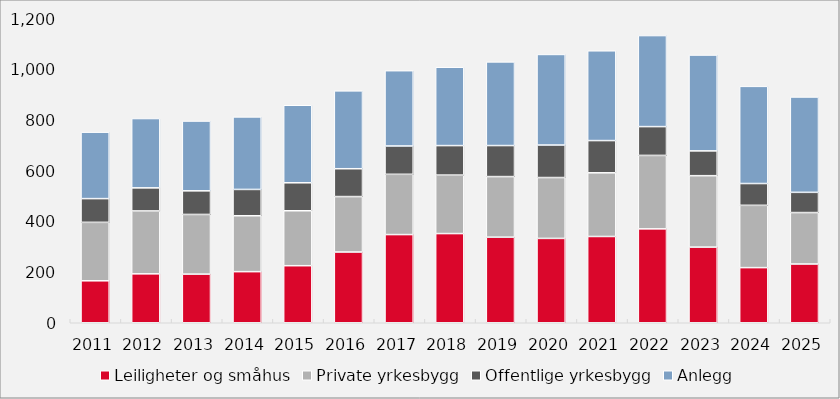
| Category | Leiligheter og småhus | Private yrkesbygg | Offentlige yrkesbygg | Anlegg |
|---|---|---|---|---|
| 2011.0 | 165.611 | 230.787 | 93.586 | 262.414 |
| 2012.0 | 193.055 | 248.314 | 91.15 | 273.632 |
| 2013.0 | 192.063 | 235.482 | 93.229 | 275.466 |
| 2014.0 | 201.737 | 220.689 | 103.832 | 286.333 |
| 2015.0 | 225.223 | 216.844 | 110.451 | 306.007 |
| 2016.0 | 279.253 | 218.835 | 109.907 | 307.342 |
| 2017.0 | 348.101 | 237.848 | 111.816 | 297.221 |
| 2018.0 | 351.997 | 230.874 | 116.433 | 309.318 |
| 2019.0 | 337.868 | 239.103 | 122.509 | 330.237 |
| 2020.0 | 332.992 | 240.224 | 128.337 | 357.559 |
| 2021.0 | 340.528 | 251.426 | 127.153 | 354.437 |
| 2022.0 | 370.607 | 289.921 | 113.769 | 359.348 |
| 2023.0 | 298.636 | 281.907 | 97.97 | 378.254 |
| 2024.0 | 217.645 | 245.89 | 86.029 | 383.59 |
| 2025.0 | 231.969 | 203.039 | 79.799 | 376.409 |